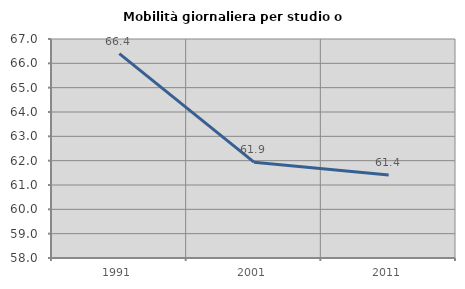
| Category | Mobilità giornaliera per studio o lavoro |
|---|---|
| 1991.0 | 66.4 |
| 2001.0 | 61.937 |
| 2011.0 | 61.412 |